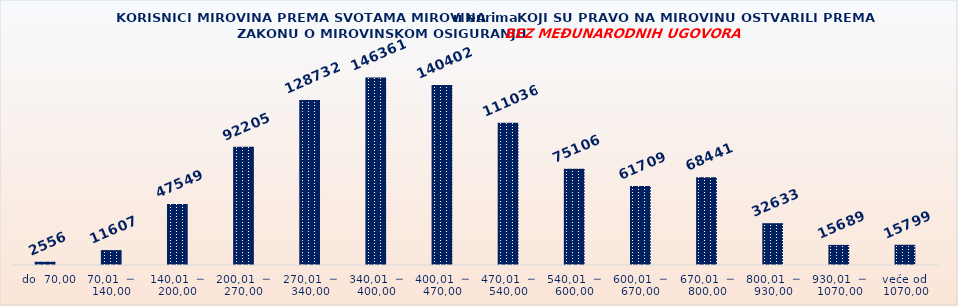
| Category | KORISNICI MIROVINA PREMA VRSTAMA I SVOTAMA MIROVINA KOJI SU PRAVO NA MIROVINU OSTVARILI PREMA ZAKONU O MIROVINSKOM OSIGURANJU 
BEZ MEĐUNARODNIH UGOVORA |
|---|---|
|   do  70,00 | 2556 |
| 70,01  ─  140,00 | 11607 |
| 140,01  ─  200,00 | 47549 |
| 200,01  ─  270,00 | 92205 |
| 270,01  ─  340,00 | 128732 |
| 340,01  ─  400,00 | 146361 |
| 400,01  ─  470,00 | 140402 |
| 470,01  ─  540,00 | 111036 |
| 540,01  ─  600,00 | 75106 |
| 600,01  ─  670,00 | 61709 |
| 670,01  ─  800,00 | 68441 |
| 800,01  ─  930,00 | 32633 |
| 930,01  ─  1070,00 | 15689 |
| veće od  1070,00 | 15799 |